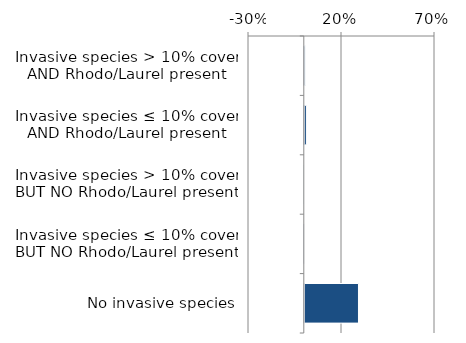
| Category | Native |
|---|---|
| No invasive species | 0.294 |
| Invasive species ≤ 10% cover BUT NO Rhodo/Laurel present | 0.002 |
| Invasive species > 10% cover BUT NO Rhodo/Laurel present | 0.001 |
| Invasive species ≤ 10% cover AND Rhodo/Laurel present | 0.014 |
| Invasive species > 10% cover AND Rhodo/Laurel present | 0.009 |